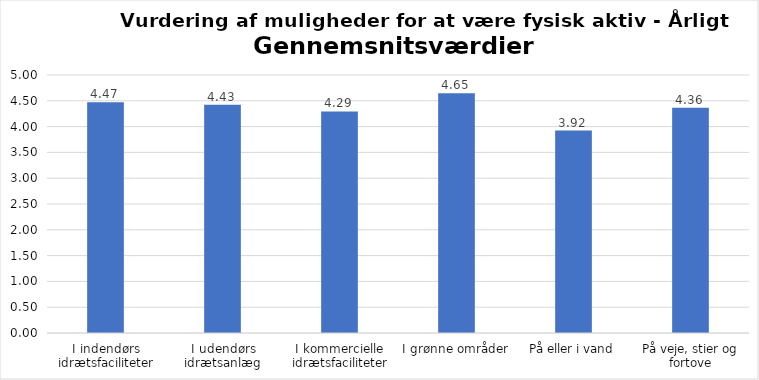
| Category | Gennemsnit |
|---|---|
| I indendørs idrætsfaciliteter | 4.472 |
| I udendørs idrætsanlæg | 4.426 |
| I kommercielle idrætsfaciliteter | 4.293 |
| I grønne områder | 4.648 |
| På eller i vand | 3.923 |
| På veje, stier og fortove | 4.364 |